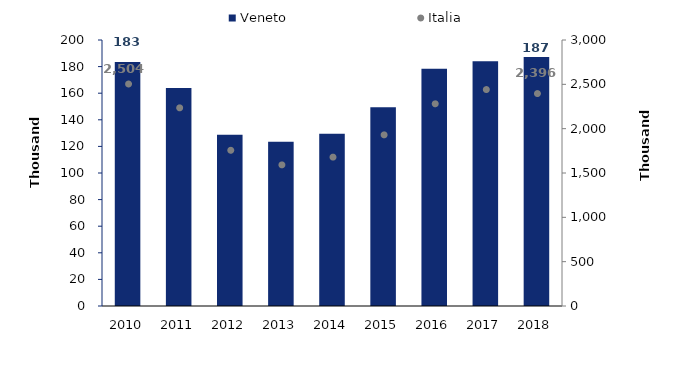
| Category | Veneto |
|---|---|
| 2010.0 | 183457 |
| 2011.0 | 163940 |
| 2012.0 | 128670 |
| 2013.0 | 123507 |
| 2014.0 | 129569 |
| 2015.0 | 149471 |
| 2016.0 | 178433 |
| 2017.0 | 183975 |
| 2018.0 | 187256 |